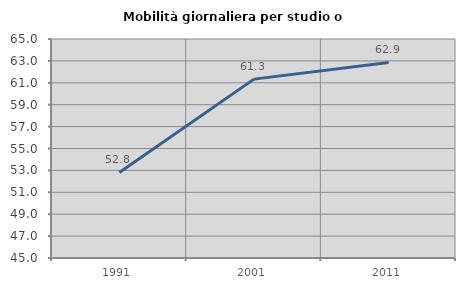
| Category | Mobilità giornaliera per studio o lavoro |
|---|---|
| 1991.0 | 52.815 |
| 2001.0 | 61.335 |
| 2011.0 | 62.863 |